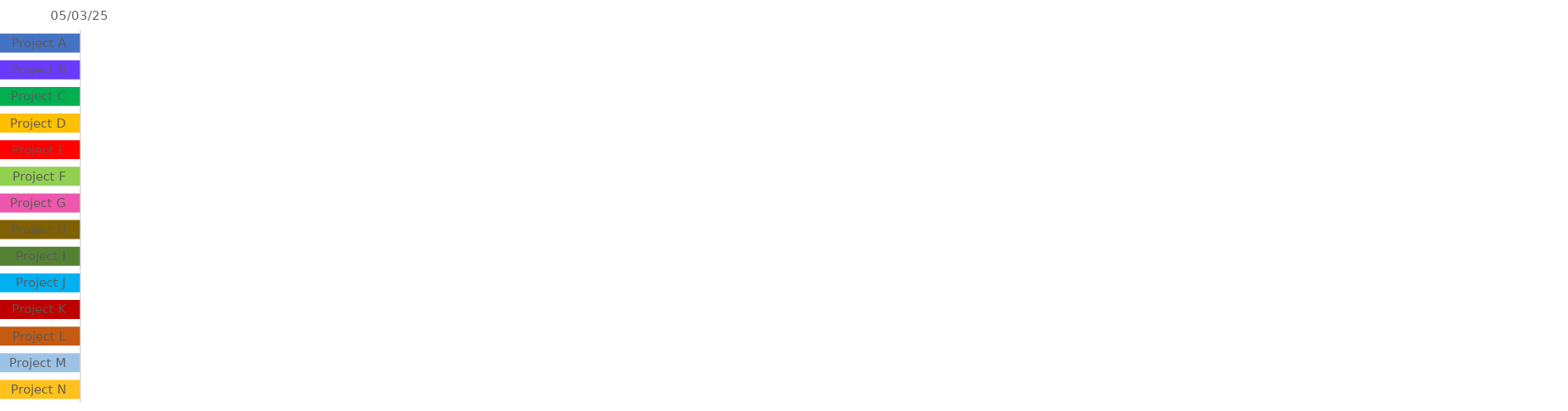
| Category | START 
DATE | Duration |
|---|---|---|
| Project A |  | 1 |
| Project B |  | 1 |
| Project C |  | 1 |
| Project D |  | 1 |
| Project E |  | 1 |
| Project F |  | 1 |
| Project G |  | 1 |
| Project H |  | 1 |
| Project I |  | 1 |
| Project J |  | 1 |
| Project K |  | 1 |
| Project L |  | 1 |
| Project M |  | 1 |
| Project N |  | 1 |